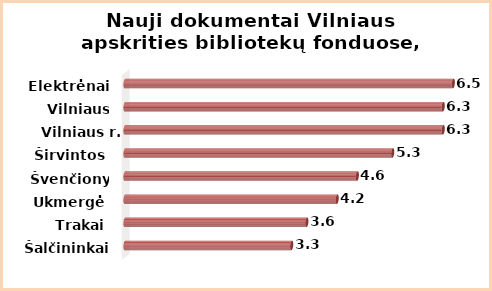
| Category | Series 0 |
|---|---|
| Šalčininkai | 3.3 |
| Trakai | 3.6 |
| Ukmergė | 4.2 |
| Švenčionys | 4.6 |
| Širvintos | 5.3 |
| Vilniaus r. | 6.3 |
| Vilniaus m. | 6.3 |
| Elektrėnai | 6.5 |